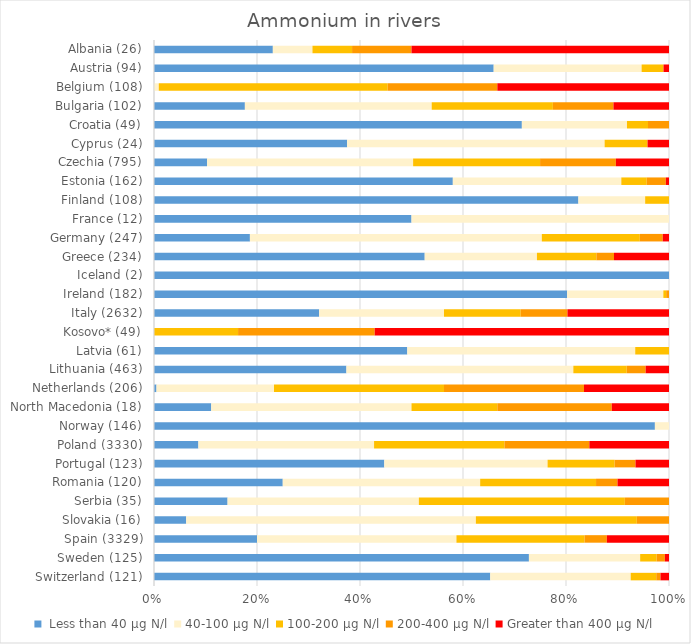
| Category |  Less than 40 µg N/l | 40-100 µg N/l | 100-200 µg N/l | 200-400 µg N/l | Greater than 400 µg N/l |
|---|---|---|---|---|---|
| Switzerland (121) | 79 | 33 | 6 | 1 | 2 |
| Sweden (125) | 91 | 27 | 4 | 2 | 1 |
| Spain (3329) | 666 | 1289 | 828 | 144 | 402 |
| Slovakia (16) | 1 | 9 | 5 | 1 | 0 |
| Serbia (35) | 5 | 13 | 14 | 3 | 0 |
| Romania (120) | 30 | 46 | 27 | 5 | 12 |
| Portugal (123) | 55 | 39 | 16 | 5 | 8 |
| Poland (3330) | 287 | 1136 | 843 | 549 | 515 |
| Norway (146) | 142 | 4 | 0 | 0 | 0 |
| North Macedonia (18) | 2 | 7 | 3 | 4 | 2 |
| Netherlands (206) | 1 | 47 | 68 | 56 | 34 |
| Lithuania (463) | 173 | 204 | 48 | 17 | 21 |
| Latvia (61) | 30 | 27 | 4 | 0 | 0 |
| Kosovo* (49) | 0 | 0 | 8 | 13 | 28 |
| Italy (2632) | 844 | 638 | 392 | 239 | 519 |
| Ireland (182) | 146 | 34 | 1 | 1 | 0 |
| Iceland (2) | 2 | 0 | 0 | 0 | 0 |
| Greece (234) | 123 | 51 | 27 | 8 | 25 |
| Germany (247) | 46 | 140 | 47 | 11 | 3 |
| France (12) | 6 | 6 | 0 | 0 | 0 |
| Finland (108) | 89 | 14 | 5 | 0 | 0 |
| Estonia (162) | 94 | 53 | 8 | 6 | 1 |
| Czechia (795) | 82 | 318 | 196 | 117 | 82 |
| Cyprus (24) | 9 | 12 | 2 | 0 | 1 |
| Croatia (49) | 35 | 10 | 2 | 2 | 0 |
| Bulgaria (102) | 18 | 37 | 24 | 12 | 11 |
| Belgium (108) | 0 | 1 | 48 | 23 | 36 |
| Austria (94) | 62 | 27 | 4 | 0 | 1 |
| Albania (26) | 6 | 2 | 2 | 3 | 13 |